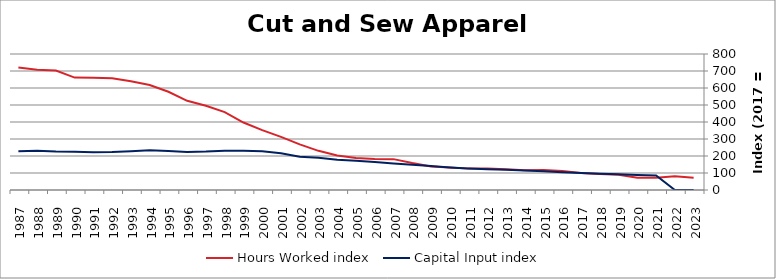
| Category | Hours Worked index | Capital Input index |
|---|---|---|
| 2023.0 | 71.851 | 0 |
| 2022.0 | 80.881 | 0 |
| 2021.0 | 71.892 | 85.387 |
| 2020.0 | 72.318 | 88.716 |
| 2019.0 | 90.348 | 92.106 |
| 2018.0 | 94.404 | 95.524 |
| 2017.0 | 100 | 100 |
| 2016.0 | 111.814 | 104.554 |
| 2015.0 | 117.599 | 109.773 |
| 2014.0 | 115.73 | 114.771 |
| 2013.0 | 122.075 | 118.61 |
| 2012.0 | 126.453 | 122.018 |
| 2011.0 | 125.747 | 126.716 |
| 2010.0 | 132.704 | 132.733 |
| 2009.0 | 138.207 | 140.595 |
| 2008.0 | 158.3 | 149.168 |
| 2007.0 | 181.534 | 156.277 |
| 2006.0 | 183.052 | 164.793 |
| 2005.0 | 188.305 | 171.422 |
| 2004.0 | 203.523 | 178.462 |
| 2003.0 | 230.319 | 189.652 |
| 2002.0 | 268.061 | 195.74 |
| 2001.0 | 312.52 | 215.99 |
| 2000.0 | 352.009 | 227.537 |
| 1999.0 | 396.894 | 230.331 |
| 1998.0 | 457.915 | 231.582 |
| 1997.0 | 495.89 | 226.086 |
| 1996.0 | 524.728 | 223.295 |
| 1995.0 | 578.058 | 229.297 |
| 1994.0 | 617.804 | 234.071 |
| 1993.0 | 639.45 | 228.345 |
| 1992.0 | 657.581 | 223 |
| 1991.0 | 659.736 | 222.098 |
| 1990.0 | 661.179 | 225.085 |
| 1989.0 | 702.766 | 226.405 |
| 1988.0 | 706.754 | 230.711 |
| 1987.0 | 719.933 | 227.881 |